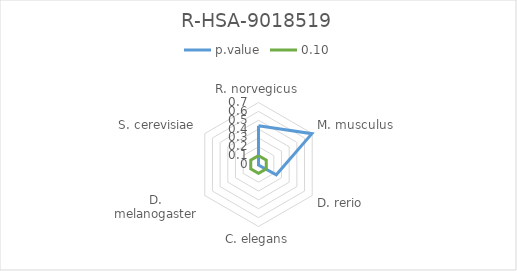
| Category | p.value | 0.10 |
|---|---|---|
| R. norvegicus | 0.438 | 0.1 |
| M. musculus | 0.696 | 0.1 |
| D. rerio | 0.232 | 0.1 |
| C. elegans | 0.006 | 0.1 |
| D. melanogaster | 0.008 | 0.1 |
| S. cerevisiae | 0.001 | 0.1 |